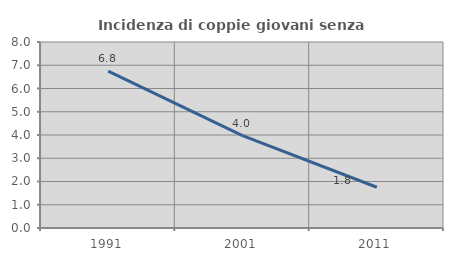
| Category | Incidenza di coppie giovani senza figli |
|---|---|
| 1991.0 | 6.752 |
| 2001.0 | 3.977 |
| 2011.0 | 1.752 |